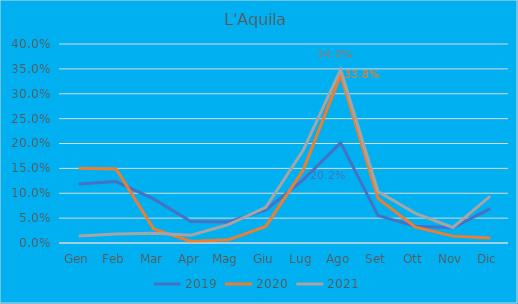
| Category | 2019 | 2020 | 2021 |
|---|---|---|---|
| Gen | 0.119 | 0.15 | 0.014 |
| Feb | 0.124 | 0.149 | 0.018 |
| Mar | 0.089 | 0.029 | 0.02 |
| Apr | 0.043 | 0.003 | 0.016 |
| Mag | 0.042 | 0.006 | 0.037 |
| Giu | 0.067 | 0.033 | 0.072 |
| Lug | 0.127 | 0.147 | 0.186 |
| Ago | 0.202 | 0.338 | 0.349 |
| Set | 0.055 | 0.089 | 0.104 |
| Ott | 0.034 | 0.032 | 0.06 |
| Nov | 0.031 | 0.014 | 0.031 |
| Dic | 0.069 | 0.01 | 0.094 |